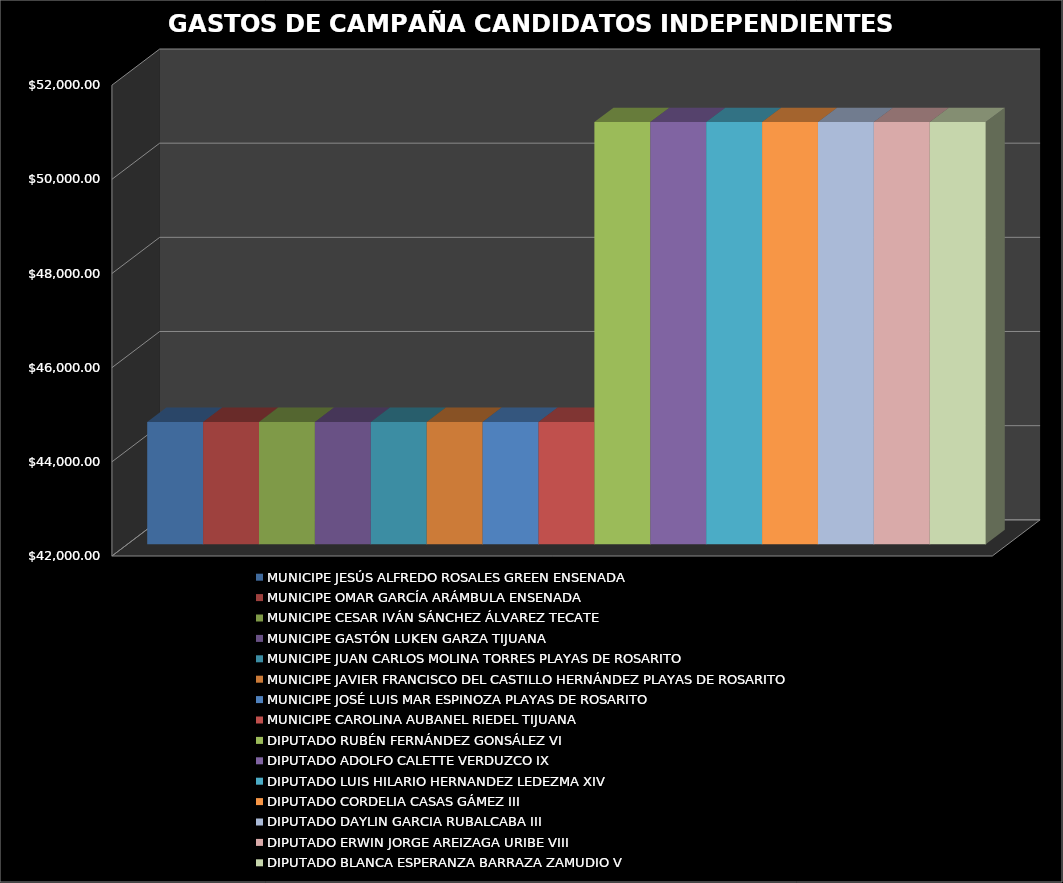
| Category | MUNICIPE | DIPUTADO |
|---|---|---|
| 0 | 44595.07 | 50965.8 |